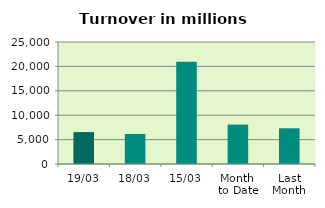
| Category | Series 0 |
|---|---|
| 19/03 | 6541.113 |
| 18/03 | 6158.333 |
| 15/03 | 20955.952 |
| Month 
to Date | 8079.812 |
| Last
Month | 7315.261 |